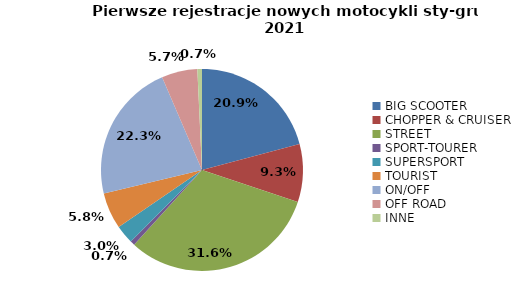
| Category | Series 0 |
|---|---|
| 0 | 4498 |
| 1 | 2003 |
| 2 | 6821 |
| 3 | 155 |
| 4 | 643 |
| 5 | 1256 |
| 6 | 4810 |
| 7 | 1234 |
| 8 | 159 |